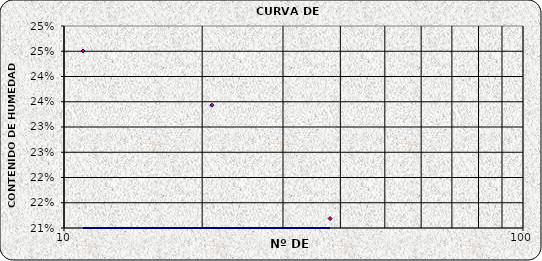
| Category | Series 0 |
|---|---|
| 38.0 | 0.212 |
| 21.0 | 0.234 |
| 11.0 | 0.245 |